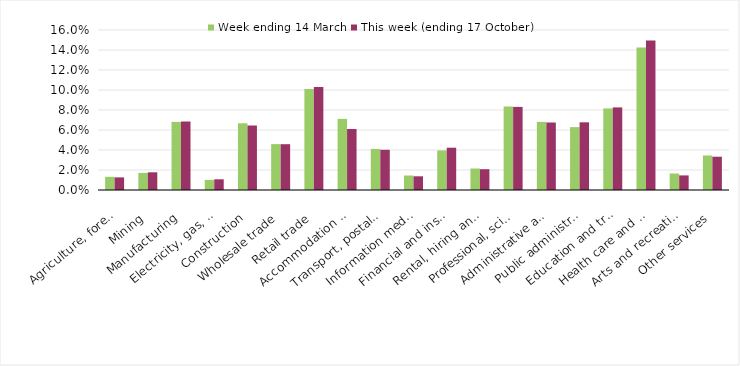
| Category | Week ending 14 March | This week (ending 17 October) |
|---|---|---|
| Agriculture, forestry and fishing | 0.013 | 0.013 |
| Mining | 0.017 | 0.018 |
| Manufacturing | 0.068 | 0.068 |
| Electricity, gas, water and waste services | 0.01 | 0.011 |
| Construction | 0.067 | 0.064 |
| Wholesale trade | 0.046 | 0.046 |
| Retail trade | 0.101 | 0.103 |
| Accommodation and food services | 0.071 | 0.061 |
| Transport, postal and warehousing | 0.041 | 0.04 |
| Information media and telecommunications | 0.014 | 0.014 |
| Financial and insurance services | 0.04 | 0.042 |
| Rental, hiring and real estate services | 0.022 | 0.021 |
| Professional, scientific and technical services | 0.084 | 0.083 |
| Administrative and support services | 0.068 | 0.068 |
| Public administration and safety | 0.063 | 0.068 |
| Education and training | 0.082 | 0.083 |
| Health care and social assistance | 0.142 | 0.15 |
| Arts and recreation services | 0.016 | 0.015 |
| Other services | 0.034 | 0.033 |